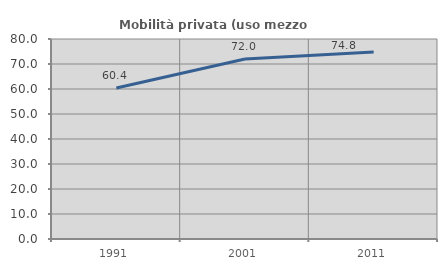
| Category | Mobilità privata (uso mezzo privato) |
|---|---|
| 1991.0 | 60.43 |
| 2001.0 | 72.022 |
| 2011.0 | 74.798 |